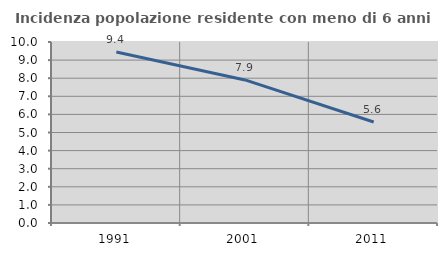
| Category | Incidenza popolazione residente con meno di 6 anni |
|---|---|
| 1991.0 | 9.444 |
| 2001.0 | 7.906 |
| 2011.0 | 5.579 |